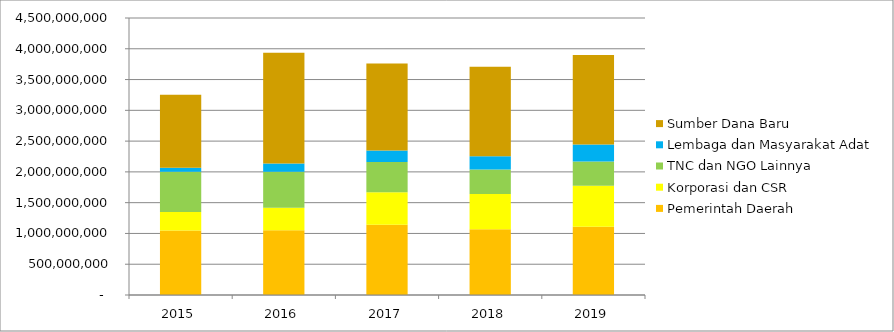
| Category | Pemerintah Daerah | Korporasi dan CSR | TNC dan NGO Lainnya | Lembaga dan Masyarakat Adat | Sumber Dana Baru |
|---|---|---|---|---|---|
|  2015  | 1049000000 | 299500000 | 653500000 | 64000000 | 1187500000 |
|  2016  | 1053100000 | 363700000 | 583600000 | 135400000 | 1800100000 |
|  2017  | 1140710000 | 528370000 | 491660000 | 184840000 | 1414260000 |
|  2018  | 1069829500 | 569567000 | 400776000 | 212404000 | 1455317500 |
|  2019  | 1110612450 | 663555700 | 396053600 | 275690400 | 1454505250 |